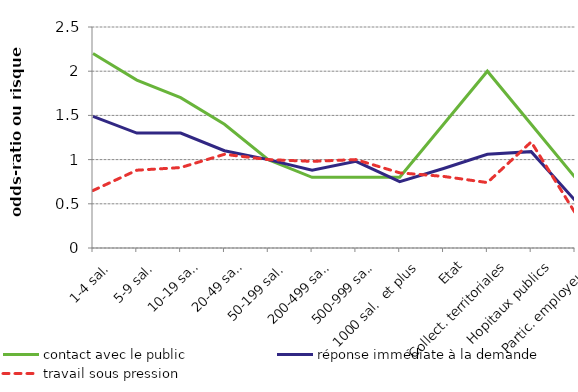
| Category | contact avec le public | réponse immédiate à la demande | travail sous pression |
|---|---|---|---|
|  1-4 sal. | 2.2 | 1.49 | 0.65 |
|  5-9 sal. | 1.9 | 1.3 | 0.88 |
|  10-19 sal. | 1.7 | 1.3 | 0.91 |
| 20-49 sal. | 1.4 | 1.1 | 1.06 |
|  50-199 sal. | 1 | 1 | 1 |
|  200-499 sal. | 0.8 | 0.88 | 0.98 |
|  500-999 sal. | 0.8 | 0.98 | 1 |
|  1000 sal.  et plus | 0.8 | 0.75 | 0.85 |
| Etat | 1.4 | 0.9 | 0.81 |
| Collect. territoriales | 2 | 1.06 | 0.74 |
| Hopitaux publics | 1.4 | 1.09 | 1.2 |
| Partic. employeurs | 0.8 | 0.54 | 0.4 |